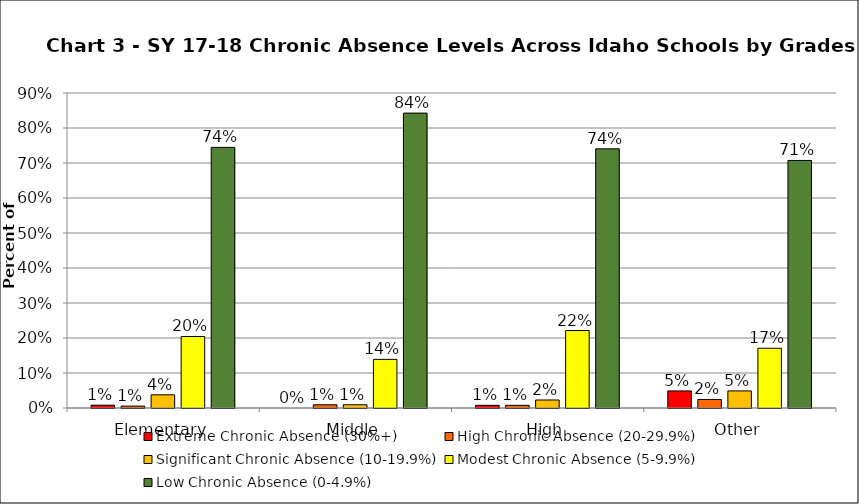
| Category | Extreme Chronic Absence (30%+) | High Chronic Absence (20-29.9%) | Significant Chronic Absence (10-19.9%) | Modest Chronic Absence (5-9.9%) | Low Chronic Absence (0-4.9%) |
|---|---|---|---|---|---|
| 0 | 0.008 | 0.005 | 0.038 | 0.204 | 0.745 |
| 1 | 0 | 0.009 | 0.009 | 0.139 | 0.843 |
| 2 | 0.008 | 0.008 | 0.023 | 0.221 | 0.74 |
| 3 | 0.049 | 0.024 | 0.049 | 0.171 | 0.707 |